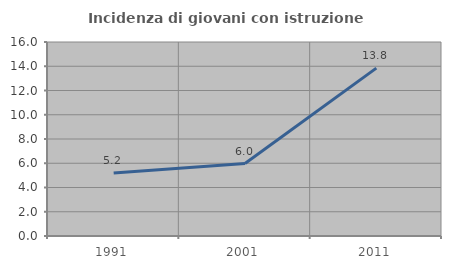
| Category | Incidenza di giovani con istruzione universitaria |
|---|---|
| 1991.0 | 5.195 |
| 2001.0 | 5.976 |
| 2011.0 | 13.842 |